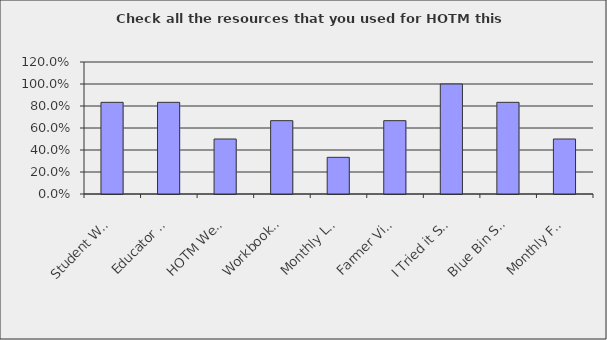
| Category | Series 0 |
|---|---|
| Student Workbooks | 0.833 |
| Educator Newsletter | 0.833 |
| HOTM Website | 0.5 |
| Workbook Teacher Guide | 0.667 |
| Monthly Lesson Plans | 0.333 |
| Farmer Videos | 0.667 |
| I Tried it Stickers | 1 |
| Blue Bin Supplies | 0.833 |
| Monthly Feedback Survey | 0.5 |